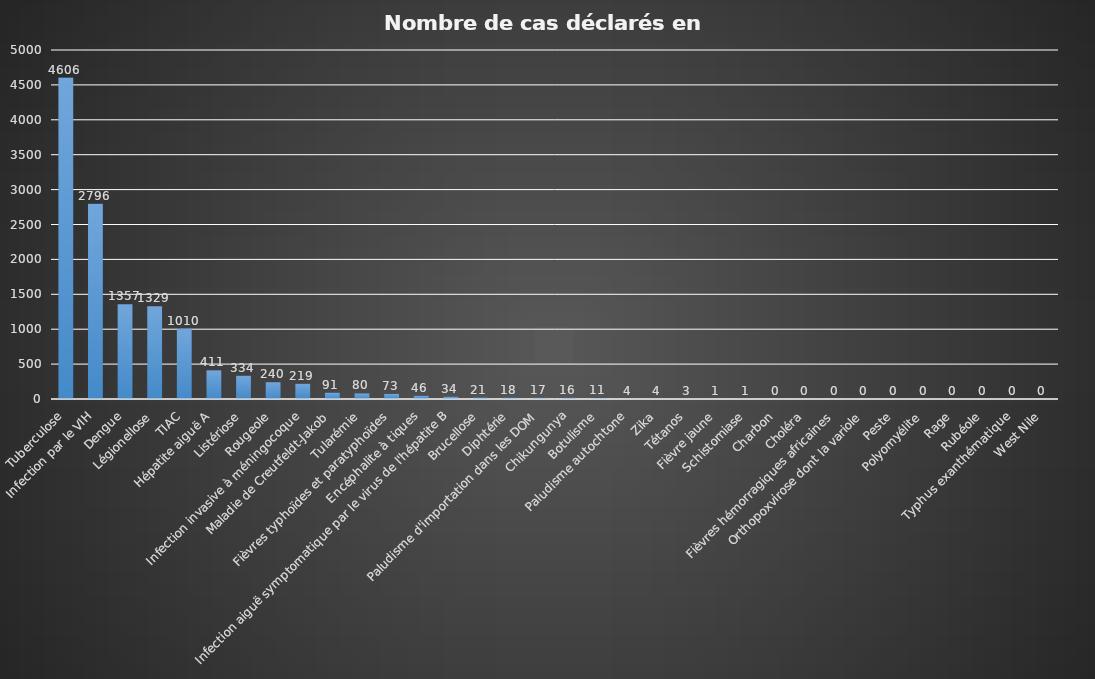
| Category | Series 0 |
|---|---|
| Tuberculose | 4606 |
| Infection par le VIH | 2796 |
| Dengue | 1357 |
| Légionellose | 1329 |
| TIAC | 1010 |
| Hépatite aiguë A | 411 |
| Listériose | 334 |
| Rougeole | 240 |
| Infection invasive à méningocoque | 219 |
| Maladie de Creutfeldt-Jakob | 91 |
| Tularémie | 80 |
| Fièvres typhoïdes et paratyphoïdes | 73 |
| Encéphalite à tiques | 46 |
| Infection aiguë symptomatique par le virus de l'hépatite B | 34 |
| Brucellose | 21 |
| Diphtérie | 18 |
| Paludisme d'importation dans les DOM | 17 |
| Chikungunya | 16 |
| Botulisme | 11 |
| Paludisme autochtone | 4 |
| Zika | 4 |
| Tétanos | 3 |
| Fièvre jaune | 1 |
| Schistomiase | 1 |
| Charbon | 0 |
| Choléra | 0 |
| Fièvres hémorragiques africaines | 0 |
| Orthopoxvirose dont la variole | 0 |
| Peste | 0 |
| Polyomyélite | 0 |
| Rage | 0 |
| Rubéole | 0 |
| Typhus exanthématique | 0 |
| West Nile | 0 |